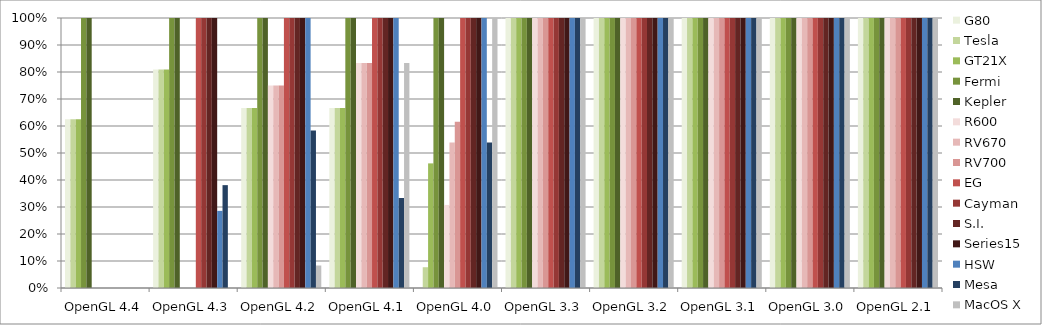
| Category | G80 | Tesla | GT21X | Fermi | Kepler | R600 | RV670 | RV700 | EG | Cayman | S.I. | Series 14 | HSW | Mesa | MacOS X |
|---|---|---|---|---|---|---|---|---|---|---|---|---|---|---|---|
| OpenGL 4.4 | 0.625 | 0.625 | 0.625 | 1 | 1 | 0 | 0 | 0 | 0 | 0 | 0 | 0 | 0 | 0 | 0 |
| OpenGL 4.3 | 0.81 | 0.81 | 0.81 | 1 | 1 | 0 | 0 | 0 | 1 | 1 | 1 | 1 | 0.286 | 0.381 | 0 |
| OpenGL 4.2 | 0.667 | 0.667 | 0.667 | 1 | 1 | 0.75 | 0.75 | 0.75 | 1 | 1 | 1 | 1 | 1 | 0.583 | 0.083 |
| OpenGL 4.1 | 0.667 | 0.667 | 0.667 | 1 | 1 | 0.833 | 0.833 | 0.833 | 1 | 1 | 1 | 1 | 1 | 0.333 | 0.833 |
| OpenGL 4.0 | 0 | 0.077 | 0.462 | 1 | 1 | 0.308 | 0.538 | 0.615 | 1 | 1 | 1 | 1 | 1 | 0.538 | 1 |
| OpenGL 3.3 | 1 | 1 | 1 | 1 | 1 | 1 | 1 | 1 | 1 | 1 | 1 | 1 | 1 | 1 | 1 |
| OpenGL 3.2 | 1 | 1 | 1 | 1 | 1 | 1 | 1 | 1 | 1 | 1 | 1 | 1 | 1 | 1 | 1 |
| OpenGL 3.1 | 1 | 1 | 1 | 1 | 1 | 1 | 1 | 1 | 1 | 1 | 1 | 1 | 1 | 1 | 1 |
| OpenGL 3.0 | 1 | 1 | 1 | 1 | 1 | 1 | 1 | 1 | 1 | 1 | 1 | 1 | 1 | 1 | 1 |
| OpenGL 2.1 | 1 | 1 | 1 | 1 | 1 | 1 | 1 | 1 | 1 | 1 | 1 | 1 | 1 | 1 | 1 |